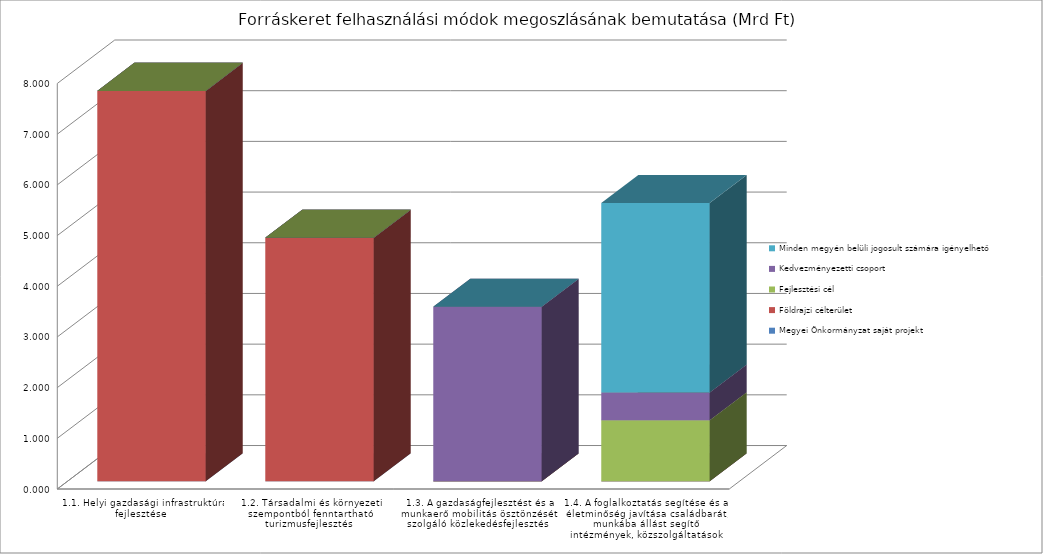
| Category | Megyei Önkormányzat saját projekt | Földrajzi célterület  | Fejlesztési cél  | Kedvezményezetti csoport | Minden megyén belüli jogosult számára igényelhető |
|---|---|---|---|---|---|
|  1.1. Helyi gazdasági infrastruktúra fejlesztése  | 0 | 7.701 | 0 | 0 | 0 |
|  1.2. Társadalmi és környezeti szempontból fenntartható turizmusfejlesztés  | 0 | 4.803 | 0 | 0 | 0 |
|  1.3. A gazdaságfejlesztést és a munkaerő mobilitás ösztönzését szolgáló közlekedésfejlesztés  | 0 | 0 | 0 | 3.443 | 0 |
|  1.4. A foglalkoztatás segítése és az életminőség javítása családbarát, munkába állást segítő intézmények, közszolgáltatások fejlesztésével  | 0 | 0 | 1.204 | 0.549 | 3.736 |